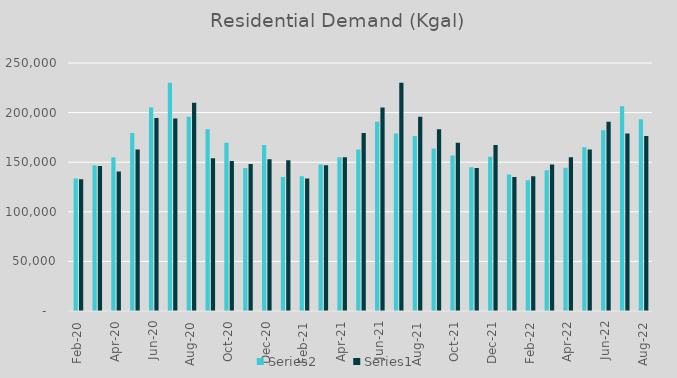
| Category | Series 1 | Series 0 |
|---|---|---|
| 2020-02-01 | 133616 | 132905 |
| 2020-03-01 | 146882 | 146212 |
| 2020-04-01 | 154955 | 140621 |
| 2020-05-01 | 179419 | 162790 |
| 2020-06-01 | 205078 | 194665 |
| 2020-07-01 | 229973 | 194086 |
| 2020-08-01 | 195761 | 209888 |
| 2020-09-01 | 183286 | 154070 |
| 2020-10-01 | 169712 | 151246 |
| 2020-11-01 | 144154 | 148146 |
| 2020-12-01 | 167244 | 152941 |
| 2021-01-01 | 135131 | 152023 |
| 2021-02-01 | 135791 | 133616 |
| 2021-03-01 | 147789 | 146882 |
| 2021-04-01 | 154879 | 154955 |
| 2021-05-01 | 162769 | 179419 |
| 2021-06-01 | 190687 | 205078 |
| 2021-07-01 | 178886 | 229973 |
| 2021-08-01 | 176317 | 195761 |
| 2021-09-01 | 163837 | 183286 |
| 2021-10-01 | 156648 | 169712 |
| 2021-11-01 | 144871 | 144154 |
| 2021-12-01 | 155618 | 167244 |
| 2022-01-01 | 137724 | 135131 |
| 2022-02-01 | 131769 | 135791 |
| 2022-03-01 | 141832 | 147789 |
| 2022-04-01 | 144486 | 154879 |
| 2022-05-01 | 165127 | 162769 |
| 2022-06-01 | 182180 | 190687 |
| 2022-07-01 | 206465 | 178886 |
| 2022-08-01 | 193258 | 176317 |